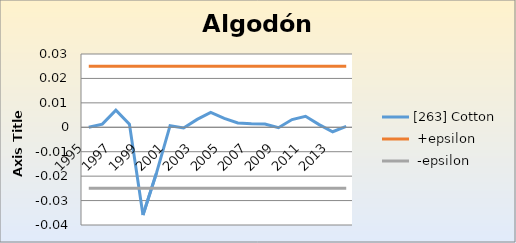
| Category | [263] Cotton |  +epsilon |  -epsilon |
|---|---|---|---|
| 1995.0 | 0 | 0.025 | -0.025 |
| 1996.0 | 0.001 | 0.025 | -0.025 |
| 1997.0 | 0.007 | 0.025 | -0.025 |
| 1998.0 | 0.001 | 0.025 | -0.025 |
| 1999.0 | -0.036 | 0.025 | -0.025 |
| 2000.0 | -0.019 | 0.025 | -0.025 |
| 2001.0 | 0.001 | 0.025 | -0.025 |
| 2002.0 | 0 | 0.025 | -0.025 |
| 2003.0 | 0.003 | 0.025 | -0.025 |
| 2004.0 | 0.006 | 0.025 | -0.025 |
| 2005.0 | 0.004 | 0.025 | -0.025 |
| 2006.0 | 0.002 | 0.025 | -0.025 |
| 2007.0 | 0.001 | 0.025 | -0.025 |
| 2008.0 | 0.001 | 0.025 | -0.025 |
| 2009.0 | 0 | 0.025 | -0.025 |
| 2010.0 | 0.003 | 0.025 | -0.025 |
| 2011.0 | 0.005 | 0.025 | -0.025 |
| 2012.0 | 0.001 | 0.025 | -0.025 |
| 2013.0 | -0.002 | 0.025 | -0.025 |
| 2014.0 | 0 | 0.025 | -0.025 |